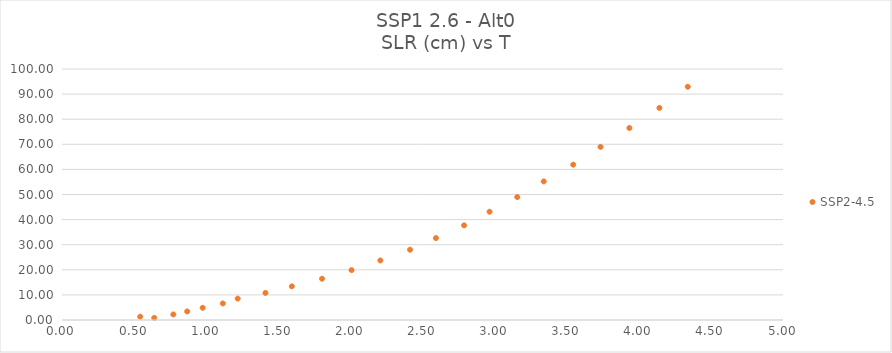
| Category | SSP2-4.5 |
|---|---|
| 0.639593181 | 0.851 |
| 0.542364652 | 1.315 |
| 0.772130534 | 2.215 |
| 0.868150926 | 3.412 |
| 0.975561417 | 4.865 |
| 1.115356613 | 6.592 |
| 1.218373475 | 8.518 |
| 1.410985436 | 10.794 |
| 1.593999848 | 13.413 |
| 1.803259946 | 16.439 |
| 2.007971221 | 19.875 |
| 2.207718083 | 23.72 |
| 2.413664456 | 27.995 |
| 2.593008574 | 32.643 |
| 2.788310632 | 37.705 |
| 2.965027005 | 43.136 |
| 3.15708926 | 48.976 |
| 3.340821123 | 55.206 |
| 3.545155632 | 61.884 |
| 3.734528966 | 68.971 |
| 3.934752593 | 76.499 |
| 4.14311073 | 84.496 |
| 4.339539848 | 92.929 |